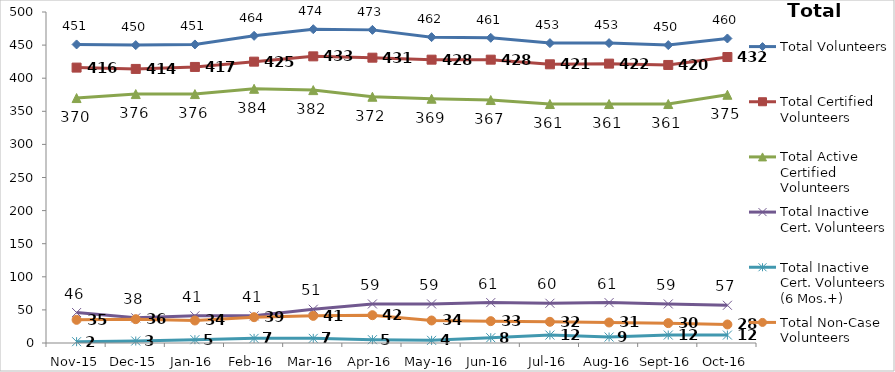
| Category | Total Volunteers | Total Certified Volunteers | Total Active Certified Volunteers | Total Inactive Cert. Volunteers | Total Inactive Cert. Volunteers (6 Mos.+) | Total Non-Case Volunteers |
|---|---|---|---|---|---|---|
| Nov-15 | 451 | 416 | 370 | 46 | 2 | 35 |
| Dec-15 | 450 | 414 | 376 | 38 | 3 | 36 |
| Jan-16 | 451 | 417 | 376 | 41 | 5 | 34 |
| Feb-16 | 464 | 425 | 384 | 41 | 7 | 39 |
| Mar-16 | 474 | 433 | 382 | 51 | 7 | 41 |
| Apr-16 | 473 | 431 | 372 | 59 | 5 | 42 |
| May-16 | 462 | 428 | 369 | 59 | 4 | 34 |
| Jun-16 | 461 | 428 | 367 | 61 | 8 | 33 |
| Jul-16 | 453 | 421 | 361 | 60 | 12 | 32 |
| Aug-16 | 453 | 422 | 361 | 61 | 9 | 31 |
| Sep-16 | 450 | 420 | 361 | 59 | 12 | 30 |
| Oct-16 | 460 | 432 | 375 | 57 | 12 | 28 |